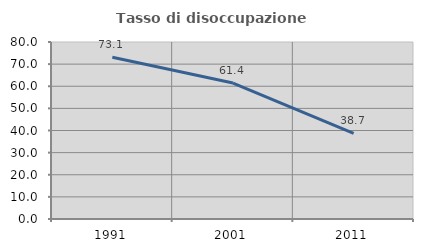
| Category | Tasso di disoccupazione giovanile  |
|---|---|
| 1991.0 | 73.139 |
| 2001.0 | 61.438 |
| 2011.0 | 38.679 |